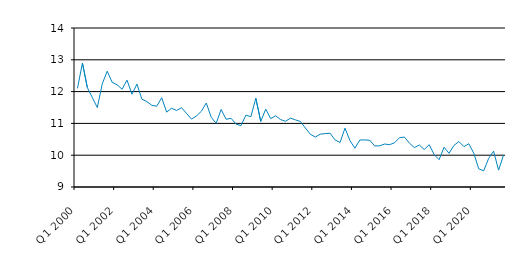
| Category | Series 0 |
|---|---|
| Q1 2000 | 12.1 |
| Q2 2000 | 12.899 |
| Q3 2000 | 12.125 |
| Q4 2000 | 11.812 |
| Q1 2001 | 11.5 |
| Q2 2001 | 12.241 |
| Q3 2001 | 12.642 |
| Q4 2001 | 12.291 |
| Q1 2002 | 12.215 |
| Q2 2002 | 12.075 |
| Q3 2002 | 12.36 |
| Q4 2002 | 11.917 |
| Q1 2003 | 12.236 |
| Q2 2003 | 11.761 |
| Q3 2003 | 11.688 |
| Q4 2003 | 11.569 |
| Q1 2004 | 11.539 |
| Q2 2004 | 11.807 |
| Q3 2004 | 11.354 |
| Q4 2004 | 11.477 |
| Q1 2005 | 11.406 |
| Q2 2005 | 11.493 |
| Q3 2005 | 11.318 |
| Q4 2005 | 11.136 |
| Q1 2006 | 11.231 |
| Q2 2006 | 11.38 |
| Q3 2006 | 11.64 |
| Q4 2006 | 11.19 |
| Q1 2007 | 11 |
| Q2 2007 | 11.44 |
| Q3 2007 | 11.13 |
| Q4 2007 | 11.16 |
| Q1 2008 | 10.98 |
| Q2 2008 | 10.93 |
| Q3 2008 | 11.26 |
| Q4 2008 | 11.21 |
| Q1 2009 | 11.79 |
| Q2 2009 | 11.06 |
| Q3 2009 | 11.45 |
| Q4 2009 | 11.15 |
| Q1 2010 | 11.24 |
| Q2 2010 | 11.12 |
| Q3 2010 | 11.067 |
| Q4 2010 | 11.166 |
| Q1 2011 | 11.11 |
| Q2 2011 | 11.06 |
| Q3 2011 | 10.855 |
| Q4 2011 | 10.66 |
| Q1 2012 | 10.57 |
| Q2 2012 | 10.66 |
| Q3 2012 | 10.68 |
| Q4 2012 | 10.69 |
| Q1 2013 | 10.48 |
| Q2 2013 | 10.4 |
| Q3 2013 | 10.85 |
| Q4 2013 | 10.46 |
| Q1 2014 | 10.22 |
| Q2 2014 | 10.479 |
| Q3 2014 | 10.48 |
| Q4 2014 | 10.47 |
| Q1 2015 | 10.29 |
| Q2 2015 | 10.295 |
| Q3 2015 | 10.352 |
| Q4 2015 | 10.33 |
| Q1 2016 | 10.39 |
| Q2 2016 | 10.55 |
| Q3 2016 | 10.57 |
| Q4 2016 | 10.38 |
| Q1 2017 | 10.24 |
| Q2 2017 | 10.32 |
| Q3 2017 | 10.18 |
| Q4 2017 | 10.33 |
| Q1 2018 | 10.02 |
| Q2 2018 | 9.86 |
| Q3 2018 | 10.251 |
| Q4 2018 | 10.06 |
| Q1 2019 | 10.308 |
| Q2 2019 | 10.429 |
| Q3 2019 | 10.27 |
| Q4 2019 | 10.36 |
| Q1 2020 | 10.06 |
| Q2 2020 | 9.57 |
| Q3 2020 | 9.51 |
| Q4 2020 | 9.9 |
| Q1 2021 | 10.128 |
| Q2 2021 | 9.53 |
| Q3 2021 | 10 |